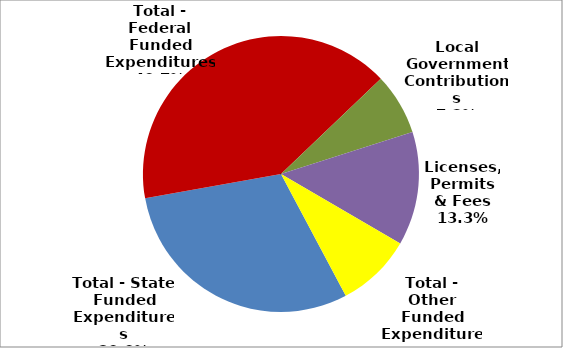
| Category | Series 0 |
|---|---|
| Total - State Funded Expenditures | 166101 |
| Total - Federal Funded Expenditures | 225584 |
| Local Government Contributions | 40060 |
| Licenses, Permits & Fees | 73797 |
| Total - Other Funded Expenditures | 48931 |